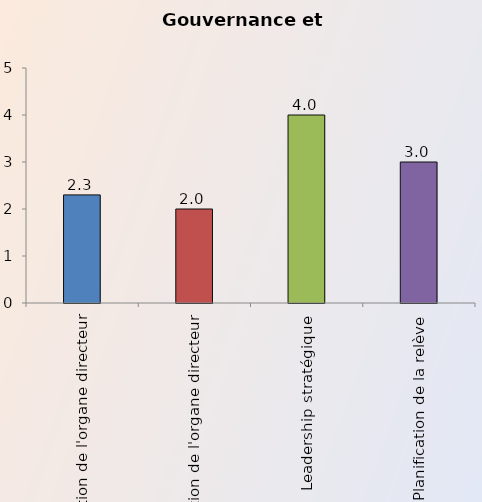
| Category | Series 0 |
|---|---|
| Constitution de l'organe directeur | 2.3 |
| Fonction de l'organe directeur | 2 |
| Leadership stratégique | 4 |
| Planification de la relève | 3 |